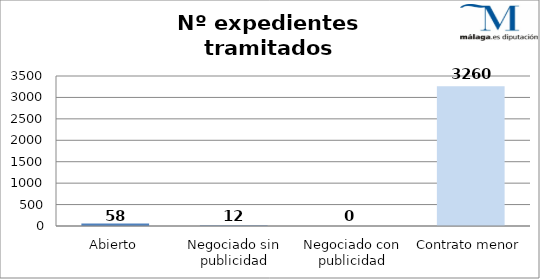
| Category | Nº expedientes |
|---|---|
| Abierto | 58 |
| Negociado sin publicidad | 12 |
| Negociado con publicidad | 0 |
| Contrato menor | 3260 |